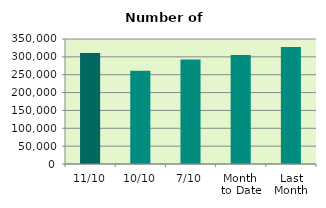
| Category | Series 0 |
|---|---|
| 11/10 | 310848 |
| 10/10 | 260852 |
| 7/10 | 292450 |
| Month 
to Date | 305403.714 |
| Last
Month | 327317.909 |